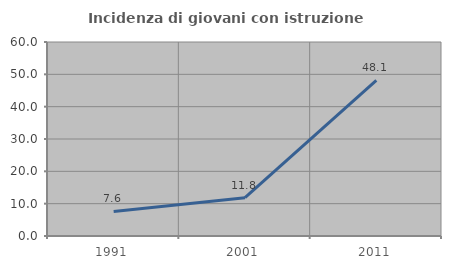
| Category | Incidenza di giovani con istruzione universitaria |
|---|---|
| 1991.0 | 7.595 |
| 2001.0 | 11.842 |
| 2011.0 | 48.148 |